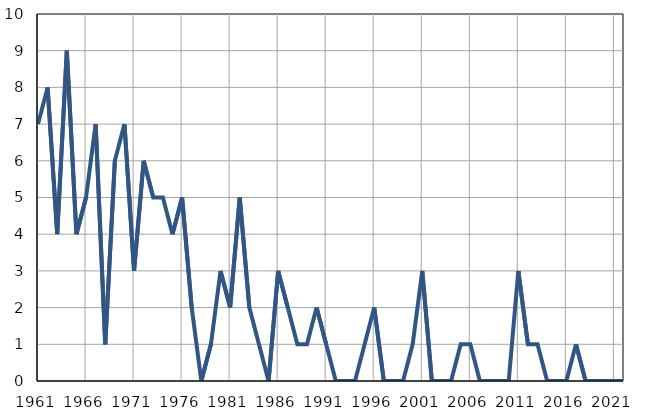
| Category | Infants
deaths |
|---|---|
| 1961.0 | 7 |
| 1962.0 | 8 |
| 1963.0 | 4 |
| 1964.0 | 9 |
| 1965.0 | 4 |
| 1966.0 | 5 |
| 1967.0 | 7 |
| 1968.0 | 1 |
| 1969.0 | 6 |
| 1970.0 | 7 |
| 1971.0 | 3 |
| 1972.0 | 6 |
| 1973.0 | 5 |
| 1974.0 | 5 |
| 1975.0 | 4 |
| 1976.0 | 5 |
| 1977.0 | 2 |
| 1978.0 | 0 |
| 1979.0 | 1 |
| 1980.0 | 3 |
| 1981.0 | 2 |
| 1982.0 | 5 |
| 1983.0 | 2 |
| 1984.0 | 1 |
| 1985.0 | 0 |
| 1986.0 | 3 |
| 1987.0 | 2 |
| 1988.0 | 1 |
| 1989.0 | 1 |
| 1990.0 | 2 |
| 1991.0 | 1 |
| 1992.0 | 0 |
| 1993.0 | 0 |
| 1994.0 | 0 |
| 1995.0 | 1 |
| 1996.0 | 2 |
| 1997.0 | 0 |
| 1998.0 | 0 |
| 1999.0 | 0 |
| 2000.0 | 1 |
| 2001.0 | 3 |
| 2002.0 | 0 |
| 2003.0 | 0 |
| 2004.0 | 0 |
| 2005.0 | 1 |
| 2006.0 | 1 |
| 2007.0 | 0 |
| 2008.0 | 0 |
| 2009.0 | 0 |
| 2010.0 | 0 |
| 2011.0 | 3 |
| 2012.0 | 1 |
| 2013.0 | 1 |
| 2014.0 | 0 |
| 2015.0 | 0 |
| 2016.0 | 0 |
| 2017.0 | 1 |
| 2018.0 | 0 |
| 2019.0 | 0 |
| 2020.0 | 0 |
| 2021.0 | 0 |
| 2022.0 | 0 |